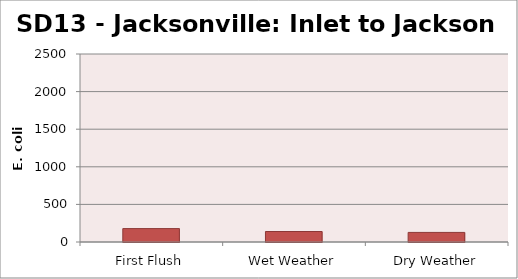
| Category | E. coli MPN |
|---|---|
| First Flush | 178.2 |
| Wet Weather | 139.6 |
| Dry Weather | 127.4 |